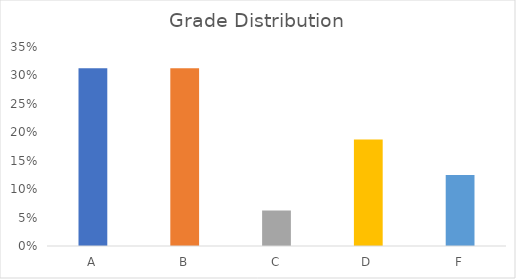
| Category | Series 0 |
|---|---|
| A | 0.312 |
| B | 0.312 |
| C | 0.062 |
| D | 0.188 |
| F | 0.125 |